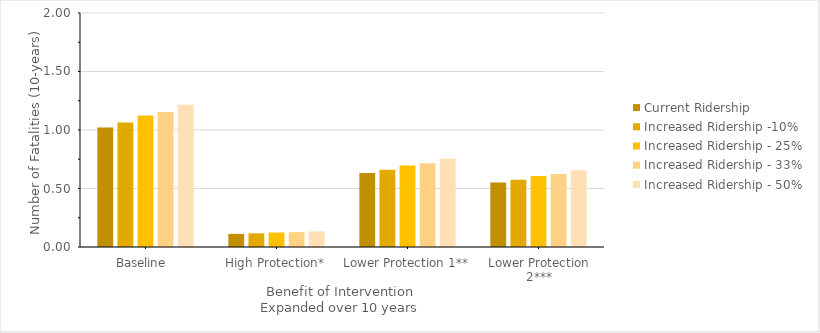
| Category | Current Ridership | Increased Ridership -10% | Increased Ridership - 25% | Increased Ridership - 33% | Increased Ridership - 50% |
|---|---|---|---|---|---|
| Baseline  | 1.021 | 1.063 | 1.123 | 1.154 | 1.215 |
| High Protection* | 0.112 | 0.117 | 0.124 | 0.127 | 0.134 |
| Lower Protection 1** | 0.633 | 0.659 | 0.697 | 0.715 | 0.753 |
| Lower Protection 2*** | 0.551 | 0.574 | 0.607 | 0.623 | 0.656 |